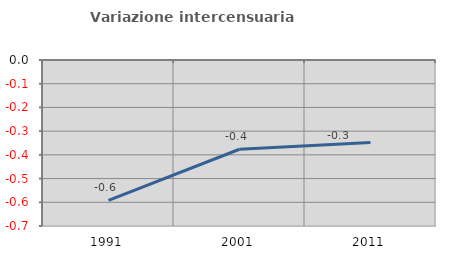
| Category | Variazione intercensuaria annua |
|---|---|
| 1991.0 | -0.592 |
| 2001.0 | -0.376 |
| 2011.0 | -0.348 |